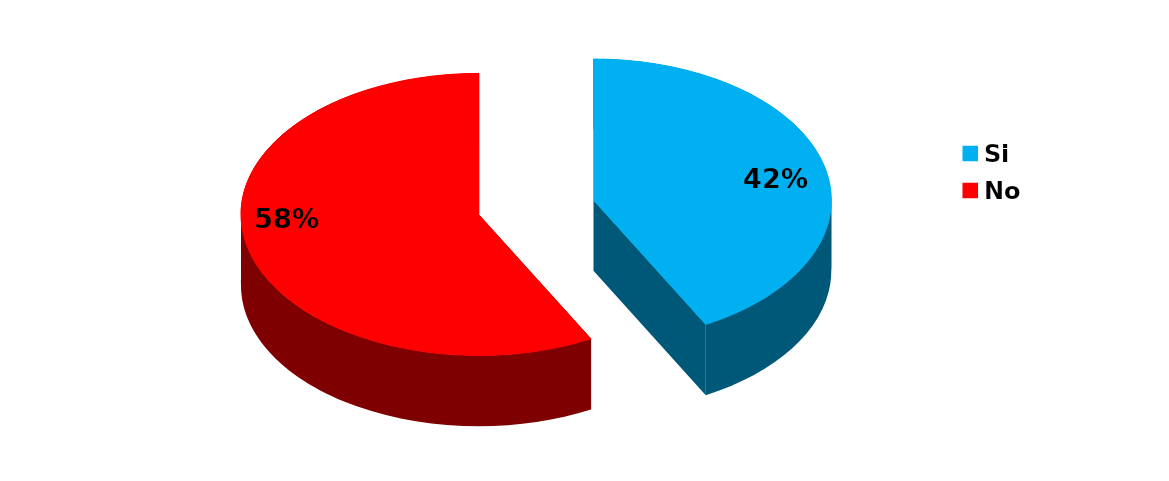
| Category | Series 0 |
|---|---|
| Si | 62 |
| No | 85 |